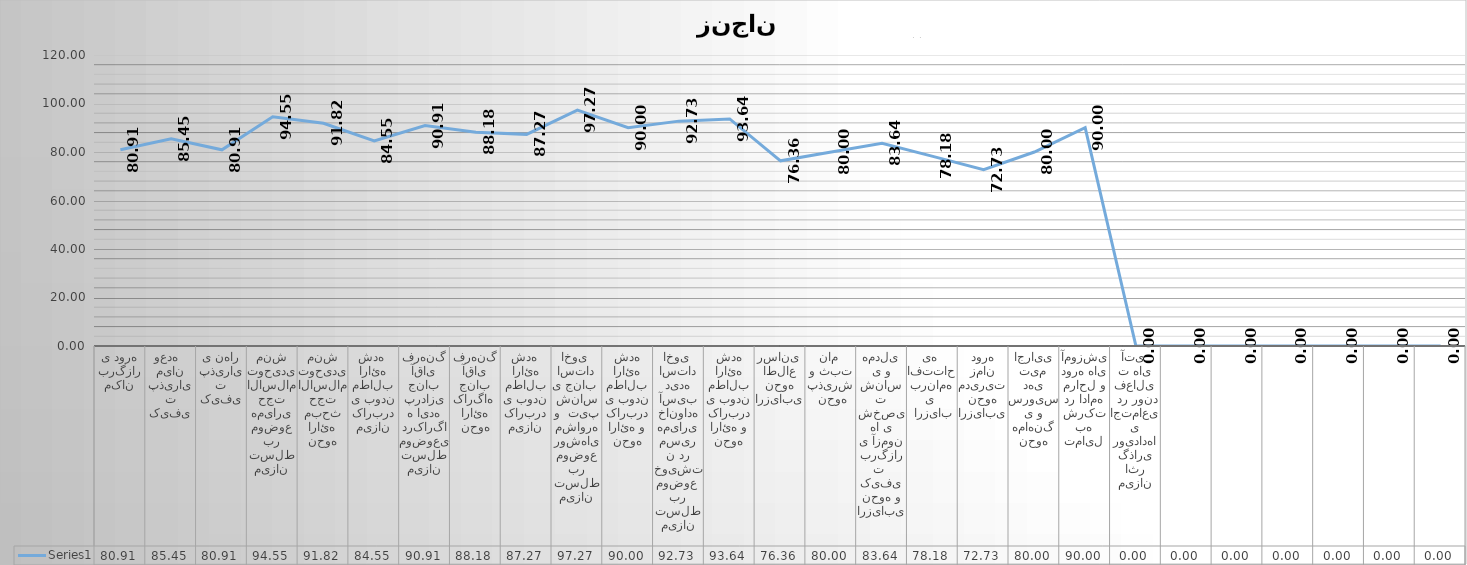
| Category | Series 0 |
|---|---|
| مکان برگزاری دوره | 80.909 |
| کیفیت پذیرای میان وعده   | 85.455 |
| کیفیت پذیرایی نهار | 80.909 |
| میزان تسلط بر موضوع همیاری حجت الاسلام توحیدی منش | 94.545 |
| نحوه ارائه مبحث حجت الاسلام توحیدی منش | 91.818 |
| میزان کاربردی بودن مطالب ارائه شده  | 84.545 |
| میزان تسلط موضوعی درکارگاه ایده پردازی جناب آقای فرهنگ | 90.909 |
| نحوه ارائه کارگاه  جناب آقای فرهنگ | 88.182 |
| میزان کاربردی بودن مطالب ارائه شده  | 87.273 |
| میزان تسلط بر موضوع روشهای مشاوره و  تیپ شناسی جناب  استاد اخوی  | 97.273 |
| نحوه ارائه و کاربردی بودن مطالب ارائه شده | 90 |
| میزان تسلط بر موضوع  خویشتن در مسیر همیاری خانواده آسیب دیده استاد اخوی  | 92.727 |
| نحوه ارائه و کاربردی بودن مطالب ارائه شده | 93.636 |
| ارزیابی نحوه اطلاع رسانی  | 76.364 |
|  نحوه پذیرش و ثبت نام  | 80 |
| ارزیابی نحوه و کیفیت  برگزاری آزمون ها ی شخصیت شناسی و همدلی | 83.636 |
|  ارزیابی  برنامه افتتاحیه  | 78.182 |
| ارزیابی نحوه مدیریت زمان دوره | 72.727 |
| نحوه هماهنگی و سرویس دهی تیم اجرایی | 80 |
| تمایل به شرکت در ادامه مراحل و دوره های آموزشی | 90 |
| میزان اثر گذاری رویدادهای اجتماعی  در روند فعالیت های آتی  | 0 |
|   | 0 |
|   | 0 |
|   | 0 |
|   | 0 |
|   | 0 |
|   | 0 |